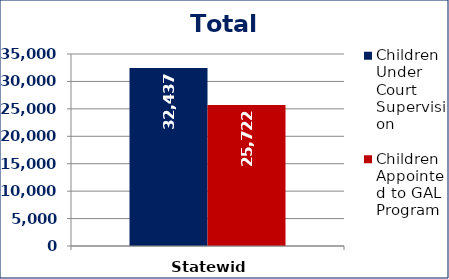
| Category | Children Under Court Supervision  | Children Appointed to GAL Program  |
|---|---|---|
| Statewide | 32437 | 25722 |